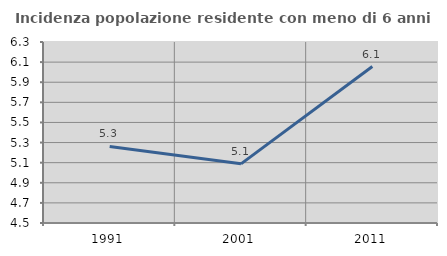
| Category | Incidenza popolazione residente con meno di 6 anni |
|---|---|
| 1991.0 | 5.261 |
| 2001.0 | 5.088 |
| 2011.0 | 6.056 |